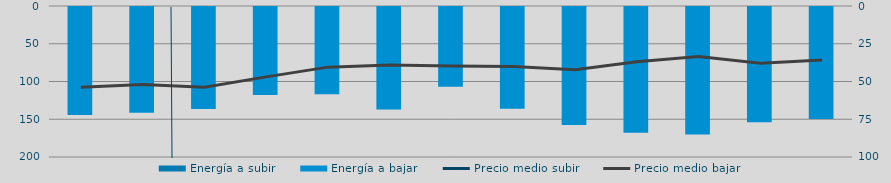
| Category | Energía a subir | Energía a bajar |
|---|---|---|
| D |  | 144.353 |
| E |  | 141.375 |
| F |  | 136.519 |
| M |  | 117.85 |
| A |  | 116.821 |
| M |  | 136.934 |
| J |  | 106.844 |
| J |  | 136.078 |
| A |  | 157.467 |
| S |  | 167.866 |
| O |  | 170.333 |
| N |  | 153.818 |
| D |  | 149.517 |